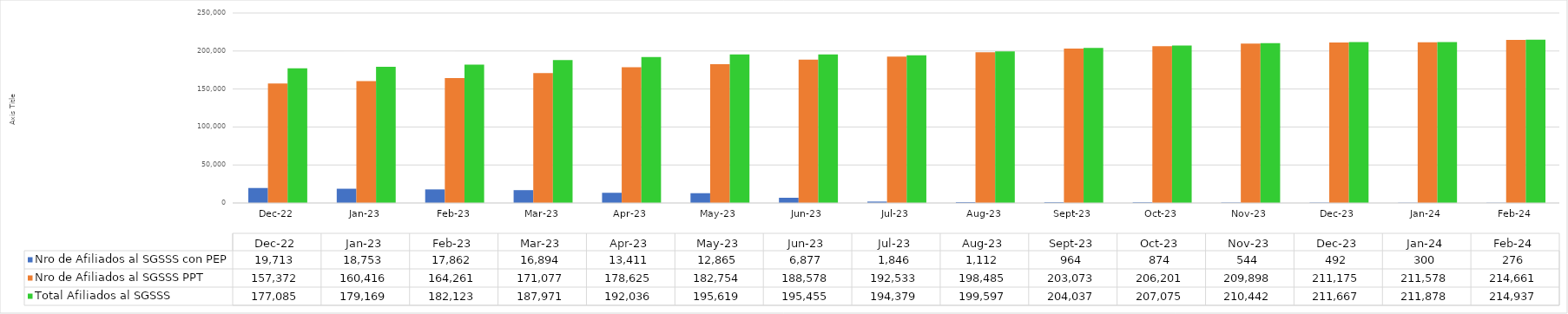
| Category | Nro de Afiliados al SGSSS con PEP | Nro de Afiliados al SGSSS PPT | Total Afiliados al SGSSS |
|---|---|---|---|
| 2022-12-01 | 19713 | 157372 | 177085 |
| 2023-01-01 | 18753 | 160416 | 179169 |
| 2023-02-01 | 17862 | 164261 | 182123 |
| 2023-03-01 | 16894 | 171077 | 187971 |
| 2023-04-01 | 13411 | 178625 | 192036 |
| 2023-05-01 | 12865 | 182754 | 195619 |
| 2023-06-01 | 6877 | 188578 | 195455 |
| 2023-07-01 | 1846 | 192533 | 194379 |
| 2023-08-01 | 1112 | 198485 | 199597 |
| 2023-09-01 | 964 | 203073 | 204037 |
| 2023-10-01 | 874 | 206201 | 207075 |
| 2023-11-01 | 544 | 209898 | 210442 |
| 2023-12-01 | 492 | 211175 | 211667 |
| 2024-01-01 | 300 | 211578 | 211878 |
| 2024-02-01 | 276 | 214661 | 214937 |